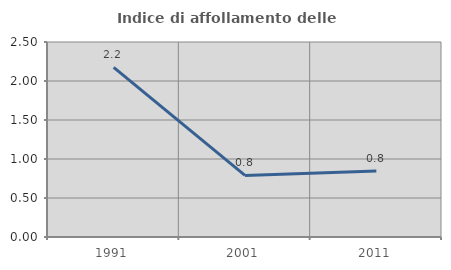
| Category | Indice di affollamento delle abitazioni  |
|---|---|
| 1991.0 | 2.174 |
| 2001.0 | 0.789 |
| 2011.0 | 0.846 |